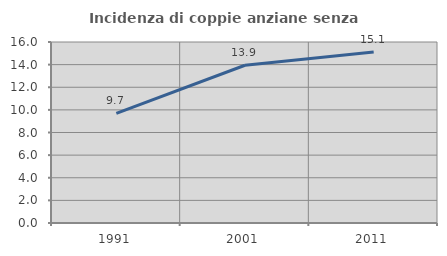
| Category | Incidenza di coppie anziane senza figli  |
|---|---|
| 1991.0 | 9.684 |
| 2001.0 | 13.945 |
| 2011.0 | 15.125 |